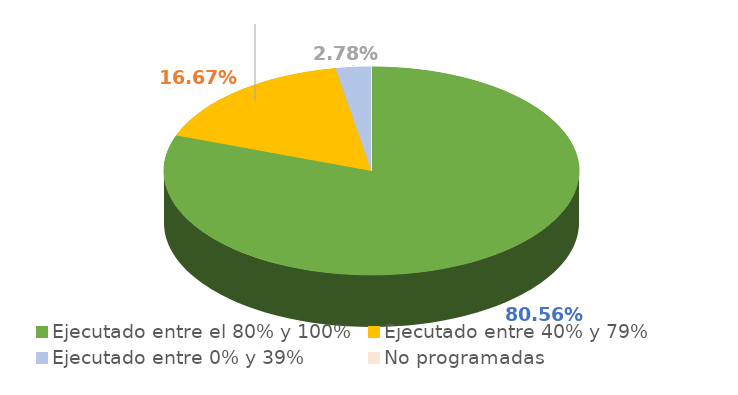
| Category | Series 0 |
|---|---|
| Ejecutado entre el 80% y 100% | 0.806 |
| Ejecutado entre 40% y 79% | 0.167 |
| Ejecutado entre 0% y 39% | 0.028 |
| No programadas | 0 |